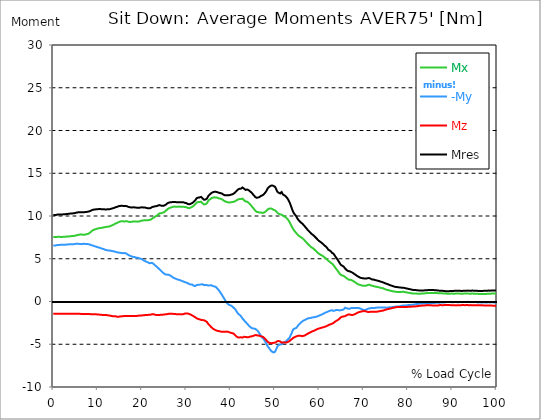
| Category |  Mx |  -My |  Mz |  Mres |
|---|---|---|---|---|
| 0.0 | 7.541 | 6.541 | -1.444 | 10.106 |
| 0.167348456675344 | 7.541 | 6.541 | -1.433 | 10.117 |
| 0.334696913350688 | 7.541 | 6.541 | -1.444 | 10.117 |
| 0.5020453700260321 | 7.541 | 6.552 | -1.444 | 10.117 |
| 0.669393826701376 | 7.53 | 6.575 | -1.444 | 10.128 |
| 0.83674228337672 | 7.541 | 6.597 | -1.444 | 10.151 |
| 1.0040907400520642 | 7.563 | 6.619 | -1.444 | 10.184 |
| 1.1621420602454444 | 7.574 | 6.619 | -1.444 | 10.184 |
| 1.3294905169207885 | 7.563 | 6.619 | -1.444 | 10.184 |
| 1.4968389735961325 | 7.563 | 6.619 | -1.444 | 10.184 |
| 1.6641874302714765 | 7.552 | 6.63 | -1.444 | 10.184 |
| 1.8315358869468206 | 7.552 | 6.63 | -1.433 | 10.184 |
| 1.9988843436221646 | 7.552 | 6.63 | -1.433 | 10.184 |
| 2.1662328002975086 | 7.563 | 6.63 | -1.444 | 10.195 |
| 2.333581256972853 | 7.563 | 6.641 | -1.433 | 10.195 |
| 2.5009297136481967 | 7.574 | 6.63 | -1.433 | 10.195 |
| 2.6682781703235405 | 7.574 | 6.641 | -1.433 | 10.206 |
| 2.8356266269988843 | 7.585 | 6.663 | -1.433 | 10.228 |
| 3.002975083674229 | 7.596 | 6.663 | -1.433 | 10.24 |
| 3.1703235403495724 | 7.607 | 6.663 | -1.433 | 10.24 |
| 3.337671997024917 | 7.607 | 6.675 | -1.433 | 10.251 |
| 3.4957233172182973 | 7.619 | 6.686 | -1.433 | 10.262 |
| 3.663071773893641 | 7.619 | 6.697 | -1.433 | 10.273 |
| 3.8304202305689854 | 7.63 | 6.697 | -1.433 | 10.284 |
| 3.997768687244329 | 7.641 | 6.708 | -1.433 | 10.295 |
| 4.165117143919673 | 7.663 | 6.697 | -1.433 | 10.306 |
| 4.332465600595017 | 7.663 | 6.708 | -1.433 | 10.306 |
| 4.499814057270361 | 7.663 | 6.708 | -1.433 | 10.317 |
| 4.667162513945706 | 7.674 | 6.708 | -1.444 | 10.317 |
| 4.834510970621049 | 7.685 | 6.719 | -1.444 | 10.339 |
| 5.001859427296393 | 7.707 | 6.741 | -1.444 | 10.362 |
| 5.169207883971737 | 7.741 | 6.752 | -1.444 | 10.395 |
| 5.336556340647081 | 7.763 | 6.741 | -1.444 | 10.417 |
| 5.503904797322425 | 7.785 | 6.73 | -1.444 | 10.417 |
| 5.671253253997769 | 7.796 | 6.741 | -1.444 | 10.428 |
| 5.82930457419115 | 7.818 | 6.741 | -1.433 | 10.439 |
| 5.996653030866494 | 7.83 | 6.73 | -1.444 | 10.451 |
| 6.164001487541838 | 7.852 | 6.719 | -1.444 | 10.451 |
| 6.331349944217181 | 7.852 | 6.708 | -1.455 | 10.451 |
| 6.498698400892526 | 7.841 | 6.719 | -1.455 | 10.451 |
| 6.66604685756787 | 7.807 | 6.741 | -1.455 | 10.451 |
| 6.833395314243213 | 7.807 | 6.763 | -1.455 | 10.462 |
| 7.000743770918558 | 7.818 | 6.741 | -1.466 | 10.451 |
| 7.168092227593902 | 7.83 | 6.719 | -1.477 | 10.451 |
| 7.335440684269246 | 7.841 | 6.719 | -1.477 | 10.462 |
| 7.50278914094459 | 7.863 | 6.73 | -1.466 | 10.484 |
| 7.6701375976199335 | 7.896 | 6.719 | -1.466 | 10.495 |
| 7.837486054295278 | 7.918 | 6.708 | -1.466 | 10.506 |
| 7.995537374488658 | 7.952 | 6.697 | -1.466 | 10.528 |
| 8.162885831164003 | 8.007 | 6.675 | -1.477 | 10.55 |
| 8.330234287839346 | 8.085 | 6.641 | -1.477 | 10.584 |
| 8.49758274451469 | 8.185 | 6.597 | -1.488 | 10.639 |
| 8.664931201190035 | 8.252 | 6.575 | -1.488 | 10.684 |
| 8.832279657865378 | 8.285 | 6.552 | -1.488 | 10.706 |
| 8.999628114540721 | 8.352 | 6.519 | -1.488 | 10.739 |
| 9.166976571216066 | 8.407 | 6.475 | -1.499 | 10.75 |
| 9.334325027891412 | 8.429 | 6.452 | -1.499 | 10.762 |
| 9.501673484566755 | 8.452 | 6.441 | -1.499 | 10.773 |
| 9.669021941242098 | 8.474 | 6.419 | -1.499 | 10.784 |
| 9.836370397917442 | 8.518 | 6.364 | -1.521 | 10.795 |
| 10.003718854592787 | 8.54 | 6.341 | -1.521 | 10.795 |
| 10.17106731126813 | 8.563 | 6.33 | -1.533 | 10.806 |
| 10.329118631461512 | 8.574 | 6.308 | -1.533 | 10.817 |
| 10.496467088136853 | 8.596 | 6.264 | -1.544 | 10.806 |
| 10.663815544812199 | 8.596 | 6.241 | -1.544 | 10.806 |
| 10.831164001487544 | 8.607 | 6.208 | -1.555 | 10.795 |
| 10.998512458162887 | 8.629 | 6.175 | -1.566 | 10.784 |
| 11.16586091483823 | 8.64 | 6.153 | -1.566 | 10.784 |
| 11.333209371513574 | 8.663 | 6.13 | -1.566 | 10.784 |
| 11.50055782818892 | 8.685 | 6.097 | -1.566 | 10.784 |
| 11.667906284864264 | 8.696 | 6.053 | -1.577 | 10.773 |
| 11.835254741539607 | 8.707 | 6.03 | -1.577 | 10.773 |
| 12.00260319821495 | 8.729 | 6.008 | -1.588 | 10.773 |
| 12.169951654890292 | 8.729 | 5.997 | -1.599 | 10.773 |
| 12.337300111565641 | 8.762 | 5.964 | -1.621 | 10.784 |
| 12.504648568240984 | 8.751 | 5.975 | -1.621 | 10.784 |
| 12.662699888434362 | 8.774 | 5.964 | -1.633 | 10.795 |
| 12.830048345109708 | 8.807 | 5.93 | -1.655 | 10.806 |
| 12.997396801785053 | 8.851 | 5.93 | -1.677 | 10.839 |
| 13.164745258460396 | 8.907 | 5.897 | -1.71 | 10.873 |
| 13.33209371513574 | 8.929 | 5.897 | -1.71 | 10.895 |
| 13.499442171811083 | 8.951 | 5.886 | -1.721 | 10.906 |
| 13.666790628486426 | 9.007 | 5.864 | -1.721 | 10.939 |
| 13.834139085161771 | 9.062 | 5.864 | -1.71 | 10.995 |
| 14.001487541837117 | 9.118 | 5.819 | -1.721 | 11.017 |
| 14.16883599851246 | 9.151 | 5.775 | -1.755 | 11.039 |
| 14.336184455187803 | 9.173 | 5.753 | -1.777 | 11.061 |
| 14.503532911863147 | 9.218 | 5.742 | -1.788 | 11.095 |
| 14.670881368538492 | 9.273 | 5.731 | -1.788 | 11.139 |
| 14.828932688731873 | 9.307 | 5.708 | -1.766 | 11.161 |
| 14.996281145407215 | 9.34 | 5.697 | -1.755 | 11.172 |
| 15.163629602082558 | 9.362 | 5.697 | -1.733 | 11.195 |
| 15.330978058757903 | 9.384 | 5.675 | -1.733 | 11.195 |
| 15.498326515433247 | 9.384 | 5.664 | -1.733 | 11.184 |
| 15.665674972108594 | 9.384 | 5.653 | -1.721 | 11.184 |
| 15.833023428783937 | 9.373 | 5.653 | -1.71 | 11.172 |
| 16.00037188545928 | 9.351 | 5.664 | -1.699 | 11.161 |
| 16.167720342134626 | 9.351 | 5.653 | -1.699 | 11.161 |
| 16.335068798809967 | 9.384 | 5.642 | -1.71 | 11.172 |
| 16.502417255485312 | 9.384 | 5.586 | -1.71 | 11.15 |
| 16.669765712160658 | 9.373 | 5.531 | -1.71 | 11.128 |
| 16.837114168836 | 9.34 | 5.464 | -1.71 | 11.084 |
| 17.004462625511344 | 9.318 | 5.42 | -1.71 | 11.05 |
| 17.16251394570472 | 9.296 | 5.364 | -1.71 | 11.017 |
| 17.32986240238007 | 9.307 | 5.342 | -1.699 | 11.017 |
| 17.497210859055414 | 9.318 | 5.297 | -1.699 | 11.006 |
| 17.664559315730756 | 9.318 | 5.264 | -1.699 | 10.995 |
| 17.8319077724061 | 9.351 | 5.231 | -1.699 | 11.006 |
| 17.999256229081443 | 9.362 | 5.22 | -1.699 | 11.017 |
| 18.166604685756788 | 9.362 | 5.198 | -1.699 | 11.017 |
| 18.333953142432133 | 9.362 | 5.198 | -1.699 | 11.006 |
| 18.501301599107478 | 9.351 | 5.175 | -1.688 | 10.995 |
| 18.668650055782823 | 9.351 | 5.131 | -1.688 | 10.984 |
| 18.835998512458165 | 9.34 | 5.131 | -1.688 | 10.973 |
| 19.00334696913351 | 9.34 | 5.131 | -1.677 | 10.961 |
| 19.170695425808855 | 9.329 | 5.12 | -1.666 | 10.95 |
| 19.338043882484197 | 9.351 | 5.053 | -1.655 | 10.961 |
| 19.496095202677576 | 9.384 | 5.02 | -1.644 | 10.973 |
| 19.66344365935292 | 9.418 | 5.009 | -1.644 | 10.995 |
| 19.830792116028263 | 9.44 | 4.998 | -1.644 | 11.006 |
| 19.998140572703612 | 9.462 | 4.953 | -1.633 | 11.017 |
| 20.165489029378953 | 9.473 | 4.898 | -1.621 | 11.006 |
| 20.3328374860543 | 9.484 | 4.82 | -1.61 | 10.995 |
| 20.500185942729644 | 9.507 | 4.775 | -1.61 | 10.995 |
| 20.667534399404985 | 9.518 | 4.742 | -1.588 | 10.995 |
| 20.83488285608033 | 9.495 | 4.709 | -1.577 | 10.961 |
| 21.002231312755672 | 9.507 | 4.653 | -1.566 | 10.939 |
| 21.16957976943102 | 9.495 | 4.62 | -1.566 | 10.917 |
| 21.336928226106362 | 9.507 | 4.576 | -1.566 | 10.906 |
| 21.504276682781704 | 9.529 | 4.52 | -1.566 | 10.895 |
| 21.67162513945705 | 9.54 | 4.476 | -1.555 | 10.895 |
| 21.82967645965043 | 9.562 | 4.431 | -1.555 | 10.895 |
| 21.997024916325774 | 9.584 | 4.498 | -1.533 | 10.95 |
| 22.16437337300112 | 9.651 | 4.531 | -1.499 | 11.017 |
| 22.33172182967646 | 9.718 | 4.498 | -1.477 | 11.061 |
| 22.499070286351806 | 9.762 | 4.442 | -1.477 | 11.072 |
| 22.666418743027148 | 9.818 | 4.365 | -1.499 | 11.095 |
| 22.833767199702496 | 9.884 | 4.287 | -1.533 | 11.117 |
| 23.00111565637784 | 9.951 | 4.209 | -1.555 | 11.139 |
| 23.168464113053183 | 9.984 | 4.131 | -1.577 | 11.15 |
| 23.335812569728528 | 10.029 | 4.065 | -1.588 | 11.161 |
| 23.50316102640387 | 10.095 | 3.987 | -1.577 | 11.184 |
| 23.670509483079215 | 10.195 | 3.898 | -1.577 | 11.239 |
| 23.83785793975456 | 10.284 | 3.82 | -1.577 | 11.272 |
| 23.995909259947936 | 10.317 | 3.743 | -1.566 | 11.272 |
| 24.163257716623285 | 10.317 | 3.665 | -1.555 | 11.239 |
| 24.330606173298627 | 10.328 | 3.565 | -1.555 | 11.206 |
| 24.49795462997397 | 10.362 | 3.487 | -1.544 | 11.206 |
| 24.665303086649313 | 10.384 | 3.398 | -1.544 | 11.195 |
| 24.83265154332466 | 10.417 | 3.332 | -1.533 | 11.195 |
| 25.0 | 10.451 | 3.265 | -1.521 | 11.217 |
| 25.167348456675345 | 10.517 | 3.21 | -1.51 | 11.261 |
| 25.334696913350694 | 10.595 | 3.154 | -1.499 | 11.317 |
| 25.502045370026035 | 10.673 | 3.11 | -1.499 | 11.383 |
| 25.669393826701377 | 10.762 | 3.143 | -1.477 | 11.461 |
| 25.836742283376722 | 10.828 | 3.143 | -1.466 | 11.517 |
| 26.004090740052067 | 10.884 | 3.143 | -1.444 | 11.561 |
| 26.17143919672741 | 10.928 | 3.121 | -1.433 | 11.594 |
| 26.329490516920792 | 10.961 | 3.054 | -1.433 | 11.594 |
| 26.49683897359613 | 10.984 | 2.965 | -1.433 | 11.606 |
| 26.66418743027148 | 11.017 | 2.932 | -1.433 | 11.617 |
| 26.831535886946828 | 11.05 | 2.865 | -1.433 | 11.628 |
| 26.998884343622166 | 11.072 | 2.81 | -1.444 | 11.639 |
| 27.166232800297514 | 11.084 | 2.765 | -1.455 | 11.639 |
| 27.333581256972852 | 11.106 | 2.721 | -1.466 | 11.65 |
| 27.5009297136482 | 11.095 | 2.688 | -1.477 | 11.628 |
| 27.668278170323543 | 11.084 | 2.654 | -1.477 | 11.617 |
| 27.835626626998888 | 11.072 | 2.588 | -1.477 | 11.594 |
| 28.002975083674233 | 11.084 | 2.565 | -1.488 | 11.606 |
| 28.170323540349575 | 11.084 | 2.543 | -1.488 | 11.606 |
| 28.33767199702492 | 11.106 | 2.543 | -1.477 | 11.617 |
| 28.50502045370026 | 11.106 | 2.51 | -1.477 | 11.617 |
| 28.663071773893645 | 11.072 | 2.465 | -1.477 | 11.594 |
| 28.830420230568986 | 11.072 | 2.432 | -1.499 | 11.594 |
| 28.99776868724433 | 11.084 | 2.41 | -1.51 | 11.606 |
| 29.165117143919673 | 11.084 | 2.366 | -1.499 | 11.606 |
| 29.33246560059502 | 11.084 | 2.332 | -1.477 | 11.606 |
| 29.499814057270367 | 11.072 | 2.288 | -1.444 | 11.572 |
| 29.66716251394571 | 11.05 | 2.266 | -1.41 | 11.539 |
| 29.834510970621054 | 11.05 | 2.243 | -1.399 | 11.539 |
| 30.00185942729639 | 11.028 | 2.21 | -1.399 | 11.506 |
| 30.169207883971744 | 10.984 | 2.177 | -1.41 | 11.461 |
| 30.33655634064708 | 10.939 | 2.143 | -1.41 | 11.406 |
| 30.50390479732243 | 10.939 | 2.066 | -1.444 | 11.395 |
| 30.671253253997772 | 10.917 | 2.032 | -1.466 | 11.372 |
| 30.829304574191156 | 10.939 | 1.999 | -1.499 | 11.383 |
| 30.996653030866494 | 10.995 | 1.988 | -1.533 | 11.428 |
| 31.164001487541842 | 11.017 | 2.01 | -1.588 | 11.45 |
| 31.331349944217187 | 11.072 | 1.977 | -1.633 | 11.517 |
| 31.498698400892525 | 11.15 | 1.932 | -1.677 | 11.594 |
| 31.666046857567874 | 11.217 | 1.844 | -1.733 | 11.661 |
| 31.833395314243212 | 11.283 | 1.788 | -1.788 | 11.739 |
| 32.00074377091856 | 11.361 | 1.81 | -1.844 | 11.828 |
| 32.1680922275939 | 11.472 | 1.877 | -1.899 | 11.961 |
| 32.33544068426925 | 11.572 | 1.932 | -1.966 | 12.083 |
| 32.50278914094459 | 11.617 | 1.932 | -2.01 | 12.128 |
| 32.670137597619934 | 11.628 | 1.955 | -2.043 | 12.15 |
| 32.83748605429528 | 11.606 | 1.977 | -2.066 | 12.139 |
| 33.004834510970625 | 11.628 | 1.966 | -2.088 | 12.172 |
| 33.162885831164004 | 11.661 | 1.955 | -2.121 | 12.216 |
| 33.33023428783935 | 11.672 | 1.999 | -2.155 | 12.239 |
| 33.497582744514695 | 11.572 | 2.01 | -2.166 | 12.15 |
| 33.664931201190036 | 11.472 | 2.01 | -2.177 | 12.05 |
| 33.83227965786538 | 11.395 | 1.977 | -2.177 | 11.961 |
| 33.99962811454073 | 11.35 | 1.91 | -2.199 | 11.905 |
| 34.16697657121607 | 11.35 | 1.888 | -2.232 | 11.894 |
| 34.33432502789141 | 11.383 | 1.944 | -2.277 | 11.928 |
| 34.50167348456676 | 11.428 | 1.955 | -2.332 | 11.972 |
| 34.6690219412421 | 11.506 | 1.91 | -2.41 | 12.05 |
| 34.83637039791744 | 11.661 | 1.877 | -2.543 | 12.216 |
| 35.00371885459279 | 11.817 | 1.866 | -2.665 | 12.372 |
| 35.17106731126814 | 11.894 | 1.877 | -2.754 | 12.472 |
| 35.338415767943474 | 11.95 | 1.888 | -2.843 | 12.538 |
| 35.49646708813686 | 12.005 | 1.888 | -2.932 | 12.605 |
| 35.6638155448122 | 12.072 | 1.899 | -3.021 | 12.694 |
| 35.831164001487544 | 12.128 | 1.844 | -3.11 | 12.749 |
| 35.998512458162885 | 12.15 | 1.799 | -3.176 | 12.783 |
| 36.165860914838234 | 12.183 | 1.788 | -3.232 | 12.816 |
| 36.333209371513576 | 12.183 | 1.766 | -3.276 | 12.827 |
| 36.50055782818892 | 12.183 | 1.755 | -3.321 | 12.838 |
| 36.667906284864266 | 12.172 | 1.699 | -3.365 | 12.827 |
| 36.83525474153961 | 12.161 | 1.621 | -3.409 | 12.816 |
| 37.002603198214956 | 12.139 | 1.51 | -3.432 | 12.783 |
| 37.1699516548903 | 12.094 | 1.399 | -3.454 | 12.738 |
| 37.337300111565646 | 12.061 | 1.31 | -3.465 | 12.716 |
| 37.50464856824098 | 12.05 | 1.199 | -3.487 | 12.694 |
| 37.66269988843437 | 12.028 | 1.066 | -3.509 | 12.683 |
| 37.83004834510971 | 12.005 | 0.933 | -3.521 | 12.661 |
| 37.99739680178505 | 11.961 | 0.8 | -3.532 | 12.627 |
| 38.16474525846039 | 11.917 | 0.655 | -3.532 | 12.583 |
| 38.33209371513574 | 11.839 | 0.511 | -3.532 | 12.516 |
| 38.49944217181109 | 11.772 | 0.366 | -3.532 | 12.461 |
| 38.666790628486424 | 11.728 | 0.222 | -3.543 | 12.427 |
| 38.83413908516178 | 11.694 | 0.078 | -3.532 | 12.427 |
| 39.001487541837115 | 11.661 | -0.067 | -3.521 | 12.427 |
| 39.16883599851246 | 11.628 | -0.178 | -3.521 | 12.427 |
| 39.336184455187805 | 11.606 | -0.278 | -3.532 | 12.427 |
| 39.503532911863154 | 11.572 | -0.344 | -3.554 | 12.427 |
| 39.670881368538495 | 11.572 | -0.4 | -3.598 | 12.438 |
| 39.83822982521384 | 11.583 | -0.433 | -3.632 | 12.461 |
| 39.996281145407224 | 11.606 | -0.455 | -3.654 | 12.483 |
| 40.163629602082565 | 11.617 | -0.5 | -3.676 | 12.505 |
| 40.33097805875791 | 11.628 | -0.566 | -3.698 | 12.527 |
| 40.498326515433256 | 11.65 | -0.655 | -3.754 | 12.572 |
| 40.6656749721086 | 11.661 | -0.733 | -3.754 | 12.616 |
| 40.83302342878393 | 11.694 | -0.811 | -3.831 | 12.683 |
| 41.00037188545929 | 11.728 | -0.888 | -3.92 | 12.749 |
| 41.16772034213463 | 11.772 | -1.022 | -4.009 | 12.838 |
| 41.33506879880997 | 11.839 | -1.166 | -4.098 | 12.938 |
| 41.50241725548531 | 11.905 | -1.288 | -4.176 | 13.038 |
| 41.66976571216066 | 11.939 | -1.433 | -4.198 | 13.105 |
| 41.837114168836 | 11.972 | -1.499 | -4.198 | 13.149 |
| 42.004462625511344 | 11.983 | -1.555 | -4.198 | 13.183 |
| 42.17181108218669 | 11.983 | -1.633 | -4.187 | 13.183 |
| 42.32986240238007 | 11.983 | -1.721 | -4.187 | 13.205 |
| 42.497210859055414 | 12.028 | -1.866 | -4.209 | 13.283 |
| 42.66455931573076 | 12.039 | -1.999 | -4.22 | 13.338 |
| 42.831907772406105 | 11.939 | -2.077 | -4.154 | 13.271 |
| 42.999256229081446 | 11.861 | -2.177 | -4.131 | 13.205 |
| 43.16660468575679 | 11.783 | -2.299 | -4.131 | 13.127 |
| 43.33395314243214 | 11.694 | -2.399 | -4.142 | 13.049 |
| 43.50130159910748 | 11.694 | -2.465 | -4.165 | 13.083 |
| 43.66865005578282 | 11.683 | -2.554 | -4.176 | 13.105 |
| 43.83599851245817 | 11.628 | -2.665 | -4.176 | 13.083 |
| 44.00334696913351 | 11.561 | -2.776 | -4.176 | 13.038 |
| 44.17069542580886 | 11.494 | -2.865 | -4.142 | 12.983 |
| 44.3380438824842 | 11.383 | -2.932 | -4.109 | 12.894 |
| 44.49609520267758 | 11.295 | -3.01 | -4.098 | 12.838 |
| 44.66344365935292 | 11.206 | -3.054 | -4.098 | 12.761 |
| 44.83079211602827 | 11.084 | -3.132 | -4.076 | 12.661 |
| 44.99814057270361 | 10.984 | -3.143 | -4.031 | 12.55 |
| 45.16548902937895 | 10.884 | -3.165 | -3.998 | 12.461 |
| 45.332837486054295 | 10.784 | -3.176 | -3.976 | 12.361 |
| 45.500185942729644 | 10.65 | -3.187 | -3.931 | 12.239 |
| 45.66753439940499 | 10.55 | -3.232 | -3.92 | 12.15 |
| 45.83488285608033 | 10.495 | -3.31 | -3.931 | 12.128 |
| 46.00223131275568 | 10.462 | -3.387 | -3.965 | 12.139 |
| 46.16957976943102 | 10.451 | -3.476 | -3.987 | 12.161 |
| 46.336928226106366 | 10.417 | -3.587 | -3.987 | 12.172 |
| 46.50427668278171 | 10.406 | -3.743 | -3.987 | 12.216 |
| 46.671625139457056 | 10.406 | -3.865 | -4.043 | 12.283 |
| 46.829676459650436 | 10.406 | -4.02 | -4.065 | 12.35 |
| 46.99702491632577 | 10.395 | -4.165 | -4.087 | 12.416 |
| 47.16437337300112 | 10.362 | -4.242 | -4.098 | 12.416 |
| 47.33172182967646 | 10.373 | -4.331 | -4.154 | 12.472 |
| 47.49907028635181 | 10.395 | -4.442 | -4.231 | 12.55 |
| 47.66641874302716 | 10.439 | -4.587 | -4.309 | 12.649 |
| 47.83376719970249 | 10.506 | -4.698 | -4.398 | 12.761 |
| 48.001115656377834 | 10.573 | -4.864 | -4.487 | 12.883 |
| 48.16846411305319 | 10.65 | -5.042 | -4.609 | 13.038 |
| 48.33581256972853 | 10.773 | -5.242 | -4.72 | 13.227 |
| 48.50316102640387 | 10.806 | -5.297 | -4.775 | 13.316 |
| 48.67050948307921 | 10.85 | -5.442 | -4.82 | 13.405 |
| 48.837857939754564 | 10.884 | -5.575 | -4.853 | 13.471 |
| 49.005206396429905 | 10.884 | -5.697 | -4.875 | 13.527 |
| 49.163257716623285 | 10.873 | -5.786 | -4.875 | 13.56 |
| 49.33060617329863 | 10.839 | -5.864 | -4.864 | 13.571 |
| 49.49795462997397 | 10.784 | -5.93 | -4.842 | 13.549 |
| 49.66530308664932 | 10.728 | -5.964 | -4.82 | 13.516 |
| 49.832651543324666 | 10.684 | -5.942 | -4.831 | 13.471 |
| 50.0 | 10.662 | -5.886 | -4.842 | 13.416 |
| 50.16734845667534 | 10.606 | -5.719 | -4.775 | 13.271 |
| 50.33469691335069 | 10.506 | -5.508 | -4.709 | 13.072 |
| 50.50204537002604 | 10.406 | -5.309 | -4.642 | 12.86 |
| 50.66939382670139 | 10.317 | -5.164 | -4.598 | 12.749 |
| 50.836742283376715 | 10.273 | -5.109 | -4.62 | 12.716 |
| 51.00409074005207 | 10.228 | -5.053 | -4.642 | 12.672 |
| 51.17143919672741 | 10.173 | -4.998 | -4.676 | 12.638 |
| 51.32949051692079 | 10.173 | -5.009 | -4.731 | 12.683 |
| 51.496838973596134 | 10.228 | -5.12 | -4.809 | 12.805 |
| 51.66418743027148 | 10.106 | -4.975 | -4.787 | 12.627 |
| 51.831535886946824 | 10.017 | -4.842 | -4.775 | 12.494 |
| 51.99888434362217 | 9.984 | -4.798 | -4.798 | 12.438 |
| 52.16623280029752 | 9.962 | -4.753 | -4.809 | 12.405 |
| 52.33358125697285 | 9.884 | -4.709 | -4.809 | 12.339 |
| 52.5009297136482 | 9.818 | -4.664 | -4.798 | 12.261 |
| 52.668278170323546 | 9.74 | -4.587 | -4.787 | 12.172 |
| 52.835626626998895 | 9.64 | -4.476 | -4.753 | 12.039 |
| 53.00297508367424 | 9.529 | -4.387 | -4.72 | 11.894 |
| 53.17032354034958 | 9.384 | -4.309 | -4.653 | 11.728 |
| 53.33767199702492 | 9.229 | -4.187 | -4.587 | 11.539 |
| 53.50502045370027 | 9.073 | -3.987 | -4.52 | 11.317 |
| 53.663071773893655 | 8.896 | -3.809 | -4.465 | 11.072 |
| 53.83042023056899 | 8.718 | -3.609 | -4.387 | 10.817 |
| 53.99776868724433 | 8.563 | -3.387 | -4.298 | 10.606 |
| 54.16511714391967 | 8.418 | -3.232 | -4.231 | 10.417 |
| 54.33246560059503 | 8.296 | -3.176 | -4.187 | 10.273 |
| 54.49981405727037 | 8.185 | -3.154 | -4.154 | 10.173 |
| 54.667162513945705 | 8.085 | -3.11 | -4.12 | 10.062 |
| 54.834510970621054 | 7.985 | -3.076 | -4.076 | 9.929 |
| 55.0018594272964 | 7.874 | -2.965 | -4.054 | 9.762 |
| 55.169207883971744 | 7.774 | -2.832 | -4.02 | 9.618 |
| 55.336556340647086 | 7.696 | -2.732 | -4.009 | 9.507 |
| 55.50390479732243 | 7.641 | -2.643 | -4.009 | 9.418 |
| 55.671253253997776 | 7.574 | -2.543 | -4.009 | 9.318 |
| 55.83860171067312 | 7.519 | -2.465 | -4.02 | 9.24 |
| 55.9966530308665 | 7.474 | -2.399 | -4.043 | 9.184 |
| 56.16400148754184 | 7.408 | -2.332 | -4.054 | 9.107 |
| 56.33134994421718 | 7.33 | -2.277 | -4.031 | 9.018 |
| 56.498698400892536 | 7.252 | -2.21 | -4.009 | 8.918 |
| 56.66604685756788 | 7.152 | -2.155 | -3.976 | 8.818 |
| 56.83339531424321 | 7.063 | -2.132 | -3.943 | 8.718 |
| 57.00074377091856 | 6.963 | -2.11 | -3.898 | 8.629 |
| 57.16809222759391 | 6.852 | -2.043 | -3.831 | 8.507 |
| 57.33544068426925 | 6.763 | -1.999 | -3.776 | 8.396 |
| 57.5027891409446 | 6.675 | -1.966 | -3.732 | 8.296 |
| 57.670137597619934 | 6.597 | -1.944 | -3.676 | 8.207 |
| 57.83748605429528 | 6.519 | -1.944 | -3.643 | 8.129 |
| 58.004834510970625 | 6.43 | -1.944 | -3.598 | 8.029 |
| 58.16288583116401 | 6.364 | -1.91 | -3.554 | 7.941 |
| 58.330234287839346 | 6.297 | -1.888 | -3.509 | 7.874 |
| 58.497582744514695 | 6.253 | -1.866 | -3.476 | 7.818 |
| 58.66493120119004 | 6.197 | -1.866 | -3.454 | 7.763 |
| 58.832279657865385 | 6.108 | -1.832 | -3.409 | 7.663 |
| 58.999628114540734 | 6.019 | -1.81 | -3.365 | 7.574 |
| 59.16697657121607 | 5.942 | -1.799 | -3.321 | 7.485 |
| 59.33432502789142 | 5.875 | -1.788 | -3.287 | 7.408 |
| 59.50167348456676 | 5.775 | -1.755 | -3.243 | 7.308 |
| 59.66902194124211 | 5.675 | -1.721 | -3.198 | 7.208 |
| 59.83637039791745 | 5.608 | -1.677 | -3.165 | 7.13 |
| 60.00371885459278 | 5.564 | -1.644 | -3.143 | 7.074 |
| 60.17106731126813 | 5.497 | -1.61 | -3.121 | 6.997 |
| 60.33841576794349 | 5.453 | -1.566 | -3.099 | 6.93 |
| 60.49646708813685 | 5.409 | -1.533 | -3.065 | 6.874 |
| 60.6638155448122 | 5.364 | -1.488 | -3.043 | 6.808 |
| 60.831164001487544 | 5.297 | -1.444 | -3.021 | 6.719 |
| 60.99851245816289 | 5.231 | -1.399 | -2.999 | 6.641 |
| 61.16586091483824 | 5.164 | -1.355 | -2.965 | 6.552 |
| 61.333209371513576 | 5.098 | -1.299 | -2.932 | 6.464 |
| 61.50055782818892 | 5.053 | -1.266 | -2.91 | 6.408 |
| 61.667906284864266 | 4.964 | -1.233 | -2.865 | 6.297 |
| 61.835254741539615 | 4.887 | -1.211 | -2.832 | 6.219 |
| 62.002603198214956 | 4.764 | -1.155 | -2.754 | 6.064 |
| 62.16995165489029 | 4.687 | -1.122 | -2.721 | 5.997 |
| 62.33730011156564 | 4.653 | -1.077 | -2.71 | 5.975 |
| 62.504648568240995 | 4.587 | -1.066 | -2.688 | 5.919 |
| 62.67199702491633 | 4.498 | -1.044 | -2.654 | 5.831 |
| 62.83004834510971 | 4.398 | -1.011 | -2.599 | 5.697 |
| 62.99739680178505 | 4.376 | -1.055 | -2.588 | 5.686 |
| 63.1647452584604 | 4.276 | -1.099 | -2.532 | 5.608 |
| 63.33209371513575 | 4.154 | -1.077 | -2.454 | 5.486 |
| 63.4994421718111 | 4.031 | -1.055 | -2.377 | 5.353 |
| 63.666790628486424 | 3.898 | -1.022 | -2.31 | 5.22 |
| 63.83413908516177 | 3.809 | -0.988 | -2.266 | 5.12 |
| 64.00148754183712 | 3.687 | -0.977 | -2.21 | 4.986 |
| 64.16883599851248 | 3.565 | -0.988 | -2.166 | 4.875 |
| 64.3361844551878 | 3.454 | -1.033 | -2.11 | 4.731 |
| 64.50353291186315 | 3.332 | -1.044 | -2.032 | 4.576 |
| 64.6708813685385 | 3.21 | -1.033 | -1.944 | 4.431 |
| 64.83822982521384 | 3.121 | -1.011 | -1.855 | 4.298 |
| 65.00557828188919 | 3.065 | -1 | -1.81 | 4.231 |
| 65.16362960208257 | 3.032 | -0.988 | -1.777 | 4.187 |
| 65.3309780587579 | 3.032 | -0.977 | -1.766 | 4.154 |
| 65.49832651543326 | 2.987 | -0.911 | -1.744 | 4.076 |
| 65.6656749721086 | 2.932 | -0.822 | -1.721 | 3.965 |
| 65.83302342878395 | 2.888 | -0.722 | -1.71 | 3.854 |
| 66.00037188545929 | 2.788 | -0.766 | -1.666 | 3.765 |
| 66.16772034213463 | 2.71 | -0.8 | -1.61 | 3.676 |
| 66.33506879880998 | 2.654 | -0.822 | -1.566 | 3.632 |
| 66.50241725548531 | 2.599 | -0.833 | -1.521 | 3.565 |
| 66.66976571216065 | 2.543 | -0.822 | -1.488 | 3.487 |
| 66.83711416883601 | 2.565 | -0.855 | -1.51 | 3.532 |
| 67.00446262551135 | 2.543 | -0.8 | -1.533 | 3.476 |
| 67.1718110821867 | 2.521 | -0.777 | -1.566 | 3.454 |
| 67.32986240238007 | 2.488 | -0.755 | -1.577 | 3.421 |
| 67.49721085905541 | 2.443 | -0.744 | -1.577 | 3.365 |
| 67.66455931573076 | 2.388 | -0.744 | -1.555 | 3.31 |
| 67.83190777240611 | 2.332 | -0.766 | -1.521 | 3.243 |
| 67.99925622908145 | 2.277 | -0.766 | -1.488 | 3.187 |
| 68.16660468575678 | 2.21 | -0.766 | -1.444 | 3.121 |
| 68.33395314243214 | 2.155 | -0.766 | -1.388 | 3.054 |
| 68.50130159910749 | 2.088 | -0.755 | -1.344 | 2.999 |
| 68.66865005578282 | 2.032 | -0.755 | -1.299 | 2.943 |
| 68.83599851245816 | 1.999 | -0.755 | -1.266 | 2.899 |
| 69.00334696913352 | 1.966 | -0.766 | -1.233 | 2.854 |
| 69.17069542580886 | 1.932 | -0.811 | -1.211 | 2.799 |
| 69.3380438824842 | 1.91 | -0.844 | -1.188 | 2.776 |
| 69.50539233915956 | 1.877 | -0.888 | -1.166 | 2.743 |
| 69.66344365935292 | 1.866 | -0.922 | -1.144 | 2.721 |
| 69.83079211602826 | 1.855 | -0.955 | -1.133 | 2.721 |
| 69.99814057270362 | 1.844 | -0.988 | -1.122 | 2.71 |
| 70.16548902937896 | 1.821 | -1.011 | -1.122 | 2.688 |
| 70.33283748605429 | 1.832 | -0.988 | -1.133 | 2.688 |
| 70.50018594272964 | 1.844 | -0.966 | -1.144 | 2.676 |
| 70.667534399405 | 1.866 | -0.922 | -1.177 | 2.699 |
| 70.83488285608033 | 1.91 | -0.888 | -1.211 | 2.721 |
| 71.00223131275568 | 1.944 | -0.855 | -1.222 | 2.732 |
| 71.16957976943102 | 1.966 | -0.822 | -1.233 | 2.743 |
| 71.33692822610637 | 1.955 | -0.811 | -1.211 | 2.721 |
| 71.50427668278171 | 1.932 | -0.789 | -1.199 | 2.688 |
| 71.67162513945706 | 1.877 | -0.766 | -1.199 | 2.621 |
| 71.8389735961324 | 1.844 | -0.744 | -1.199 | 2.588 |
| 71.99702491632577 | 1.832 | -0.755 | -1.199 | 2.588 |
| 72.16437337300113 | 1.821 | -0.766 | -1.211 | 2.577 |
| 72.33172182967647 | 1.788 | -0.766 | -1.211 | 2.554 |
| 72.49907028635181 | 1.755 | -0.755 | -1.211 | 2.521 |
| 72.66641874302715 | 1.733 | -0.722 | -1.211 | 2.499 |
| 72.8337671997025 | 1.721 | -0.722 | -1.199 | 2.477 |
| 73.00111565637783 | 1.71 | -0.722 | -1.188 | 2.454 |
| 73.16846411305319 | 1.699 | -0.711 | -1.177 | 2.432 |
| 73.33581256972853 | 1.677 | -0.7 | -1.155 | 2.41 |
| 73.50316102640387 | 1.644 | -0.711 | -1.144 | 2.388 |
| 73.67050948307921 | 1.621 | -0.711 | -1.133 | 2.354 |
| 73.83785793975457 | 1.599 | -0.7 | -1.111 | 2.321 |
| 74.00520639642991 | 1.577 | -0.689 | -1.099 | 2.299 |
| 74.16325771662328 | 1.577 | -0.689 | -1.077 | 2.277 |
| 74.33060617329863 | 1.555 | -0.689 | -1.066 | 2.254 |
| 74.49795462997398 | 1.51 | -0.7 | -1.044 | 2.21 |
| 74.66530308664932 | 1.477 | -0.689 | -1.011 | 2.177 |
| 74.83265154332466 | 1.422 | -0.711 | -0.977 | 2.132 |
| 75.00000000000001 | 1.399 | -0.722 | -0.944 | 2.099 |
| 75.16734845667534 | 1.377 | -0.722 | -0.922 | 2.077 |
| 75.3346969133507 | 1.355 | -0.711 | -0.911 | 2.032 |
| 75.50204537002605 | 1.333 | -0.711 | -0.888 | 2.01 |
| 75.66939382670138 | 1.322 | -0.689 | -0.866 | 1.966 |
| 75.83674228337672 | 1.288 | -0.677 | -0.844 | 1.932 |
| 76.00409074005208 | 1.266 | -0.689 | -0.822 | 1.91 |
| 76.17143919672742 | 1.244 | -0.689 | -0.811 | 1.877 |
| 76.33878765340276 | 1.222 | -0.655 | -0.789 | 1.832 |
| 76.49683897359614 | 1.211 | -0.644 | -0.755 | 1.81 |
| 76.66418743027148 | 1.188 | -0.633 | -0.733 | 1.777 |
| 76.83153588694682 | 1.166 | -0.622 | -0.722 | 1.755 |
| 76.99888434362218 | 1.155 | -0.611 | -0.7 | 1.733 |
| 77.16623280029752 | 1.144 | -0.6 | -0.689 | 1.71 |
| 77.33358125697285 | 1.133 | -0.6 | -0.677 | 1.699 |
| 77.5009297136482 | 1.122 | -0.589 | -0.655 | 1.688 |
| 77.66827817032356 | 1.111 | -0.589 | -0.644 | 1.666 |
| 77.83562662699889 | 1.111 | -0.589 | -0.633 | 1.666 |
| 78.00297508367423 | 1.099 | -0.578 | -0.622 | 1.655 |
| 78.17032354034959 | 1.099 | -0.555 | -0.633 | 1.644 |
| 78.33767199702493 | 1.111 | -0.533 | -0.633 | 1.633 |
| 78.50502045370027 | 1.122 | -0.5 | -0.655 | 1.621 |
| 78.67236891037561 | 1.133 | -0.489 | -0.655 | 1.621 |
| 78.83042023056899 | 1.133 | -0.478 | -0.655 | 1.61 |
| 78.99776868724433 | 1.133 | -0.466 | -0.655 | 1.599 |
| 79.16511714391969 | 1.111 | -0.466 | -0.655 | 1.588 |
| 79.33246560059503 | 1.099 | -0.455 | -0.655 | 1.566 |
| 79.49981405727036 | 1.077 | -0.455 | -0.644 | 1.544 |
| 79.66716251394571 | 1.066 | -0.455 | -0.644 | 1.533 |
| 79.83451097062107 | 1.055 | -0.444 | -0.633 | 1.51 |
| 80.00185942729641 | 1.033 | -0.433 | -0.622 | 1.488 |
| 80.16920788397174 | 1.011 | -0.411 | -0.611 | 1.466 |
| 80.33655634064709 | 1 | -0.4 | -0.611 | 1.444 |
| 80.50390479732243 | 0.988 | -0.4 | -0.611 | 1.433 |
| 80.67125325399778 | 0.966 | -0.389 | -0.6 | 1.41 |
| 80.83860171067312 | 0.955 | -0.389 | -0.6 | 1.388 |
| 80.99665303086651 | 0.944 | -0.389 | -0.589 | 1.377 |
| 81.16400148754184 | 0.933 | -0.378 | -0.589 | 1.355 |
| 81.3313499442172 | 0.933 | -0.355 | -0.578 | 1.344 |
| 81.49869840089255 | 0.933 | -0.333 | -0.578 | 1.333 |
| 81.66604685756786 | 0.922 | -0.311 | -0.566 | 1.333 |
| 81.83339531424322 | 0.911 | -0.3 | -0.566 | 1.333 |
| 82.00074377091858 | 0.922 | -0.3 | -0.566 | 1.322 |
| 82.16809222759392 | 0.911 | -0.289 | -0.544 | 1.31 |
| 82.33544068426926 | 0.9 | -0.267 | -0.522 | 1.299 |
| 82.50278914094459 | 0.9 | -0.255 | -0.511 | 1.288 |
| 82.67013759761994 | 0.911 | -0.244 | -0.511 | 1.299 |
| 82.83748605429528 | 0.922 | -0.244 | -0.5 | 1.299 |
| 83.00483451097062 | 0.922 | -0.244 | -0.489 | 1.299 |
| 83.17218296764597 | 0.922 | -0.244 | -0.478 | 1.288 |
| 83.33023428783935 | 0.933 | -0.233 | -0.455 | 1.277 |
| 83.4975827445147 | 0.933 | -0.211 | -0.466 | 1.288 |
| 83.66493120119004 | 0.944 | -0.211 | -0.466 | 1.299 |
| 83.83227965786537 | 0.955 | -0.233 | -0.466 | 1.31 |
| 83.99962811454073 | 0.966 | -0.233 | -0.455 | 1.31 |
| 84.16697657121607 | 0.977 | -0.222 | -0.433 | 1.31 |
| 84.33432502789142 | 0.988 | -0.211 | -0.422 | 1.322 |
| 84.50167348456677 | 0.988 | -0.2 | -0.422 | 1.333 |
| 84.6690219412421 | 0.988 | -0.2 | -0.433 | 1.333 |
| 84.83637039791745 | 0.988 | -0.2 | -0.444 | 1.333 |
| 85.0037188545928 | 0.988 | -0.222 | -0.444 | 1.333 |
| 85.17106731126813 | 0.988 | -0.211 | -0.444 | 1.333 |
| 85.33841576794349 | 1 | -0.2 | -0.444 | 1.344 |
| 85.50576422461883 | 1 | -0.178 | -0.466 | 1.344 |
| 85.66381554481221 | 0.988 | -0.178 | -0.466 | 1.333 |
| 85.83116400148755 | 0.988 | -0.189 | -0.466 | 1.333 |
| 85.99851245816289 | 1 | -0.178 | -0.455 | 1.322 |
| 86.16586091483823 | 1 | -0.155 | -0.455 | 1.322 |
| 86.33320937151358 | 1 | -0.133 | -0.444 | 1.322 |
| 86.50055782818893 | 0.988 | -0.122 | -0.455 | 1.31 |
| 86.66790628486427 | 0.977 | -0.133 | -0.455 | 1.299 |
| 86.83525474153961 | 0.966 | -0.144 | -0.455 | 1.277 |
| 87.00260319821496 | 0.955 | -0.144 | -0.433 | 1.266 |
| 87.16995165489031 | 0.955 | -0.133 | -0.422 | 1.266 |
| 87.33730011156564 | 0.966 | -0.122 | -0.422 | 1.266 |
| 87.504648568241 | 0.955 | -0.122 | -0.422 | 1.255 |
| 87.67199702491634 | 0.955 | -0.122 | -0.422 | 1.255 |
| 87.83004834510972 | 0.955 | -0.122 | -0.433 | 1.255 |
| 87.99739680178506 | 0.944 | -0.111 | -0.433 | 1.244 |
| 88.1647452584604 | 0.933 | -0.111 | -0.422 | 1.222 |
| 88.33209371513574 | 0.922 | -0.111 | -0.411 | 1.211 |
| 88.49944217181108 | 0.922 | -0.078 | -0.411 | 1.211 |
| 88.66679062848644 | 0.922 | -0.067 | -0.411 | 1.222 |
| 88.83413908516178 | 0.922 | -0.067 | -0.422 | 1.211 |
| 89.00148754183712 | 0.911 | -0.089 | -0.411 | 1.211 |
| 89.16883599851246 | 0.911 | -0.067 | -0.4 | 1.199 |
| 89.33618445518782 | 0.911 | -0.056 | -0.411 | 1.211 |
| 89.50353291186315 | 0.922 | -0.044 | -0.422 | 1.222 |
| 89.6708813685385 | 0.922 | -0.056 | -0.433 | 1.222 |
| 89.83822982521386 | 0.933 | -0.078 | -0.444 | 1.233 |
| 90.00557828188919 | 0.922 | -0.089 | -0.433 | 1.222 |
| 90.16362960208257 | 0.911 | -0.089 | -0.433 | 1.222 |
| 90.3309780587579 | 0.911 | -0.067 | -0.433 | 1.233 |
| 90.49832651543326 | 0.922 | -0.056 | -0.444 | 1.255 |
| 90.66567497210859 | 0.922 | -0.067 | -0.455 | 1.255 |
| 90.83302342878395 | 0.933 | -0.067 | -0.455 | 1.255 |
| 91.00037188545929 | 0.933 | -0.067 | -0.444 | 1.255 |
| 91.16772034213463 | 0.933 | -0.078 | -0.444 | 1.255 |
| 91.33506879880998 | 0.933 | -0.089 | -0.433 | 1.255 |
| 91.50241725548533 | 0.922 | -0.078 | -0.433 | 1.244 |
| 91.66976571216065 | 0.922 | -0.056 | -0.433 | 1.255 |
| 91.83711416883601 | 0.911 | -0.056 | -0.433 | 1.244 |
| 92.00446262551137 | 0.911 | -0.067 | -0.433 | 1.233 |
| 92.1718110821867 | 0.911 | -0.078 | -0.422 | 1.233 |
| 92.33915953886203 | 0.911 | -0.078 | -0.411 | 1.244 |
| 92.49721085905541 | 0.922 | -0.044 | -0.411 | 1.255 |
| 92.66455931573077 | 0.933 | -0.033 | -0.422 | 1.266 |
| 92.83190777240611 | 0.933 | -0.044 | -0.433 | 1.266 |
| 92.99925622908145 | 0.922 | -0.067 | -0.422 | 1.255 |
| 93.1666046857568 | 0.922 | -0.067 | -0.411 | 1.255 |
| 93.33395314243214 | 0.933 | -0.044 | -0.411 | 1.266 |
| 93.50130159910749 | 0.933 | -0.033 | -0.422 | 1.277 |
| 93.66865005578283 | 0.922 | -0.044 | -0.433 | 1.266 |
| 93.83599851245818 | 0.922 | -0.067 | -0.433 | 1.266 |
| 94.00334696913353 | 0.911 | -0.078 | -0.422 | 1.255 |
| 94.17069542580886 | 0.911 | -0.078 | -0.422 | 1.255 |
| 94.3380438824842 | 0.922 | -0.067 | -0.422 | 1.266 |
| 94.50539233915954 | 0.933 | -0.044 | -0.433 | 1.277 |
| 94.66344365935292 | 0.922 | -0.067 | -0.433 | 1.277 |
| 94.83079211602828 | 0.922 | -0.078 | -0.433 | 1.266 |
| 94.99814057270362 | 0.911 | -0.078 | -0.422 | 1.266 |
| 95.16548902937897 | 0.922 | -0.056 | -0.433 | 1.266 |
| 95.33283748605432 | 0.911 | -0.067 | -0.433 | 1.266 |
| 95.50018594272963 | 0.911 | -0.078 | -0.444 | 1.266 |
| 95.66753439940499 | 0.9 | -0.111 | -0.444 | 1.255 |
| 95.83488285608034 | 0.877 | -0.122 | -0.433 | 1.233 |
| 96.00223131275567 | 0.877 | -0.1 | -0.433 | 1.244 |
| 96.16957976943102 | 0.888 | -0.089 | -0.444 | 1.244 |
| 96.33692822610638 | 0.888 | -0.1 | -0.455 | 1.244 |
| 96.50427668278171 | 0.877 | -0.111 | -0.455 | 1.233 |
| 96.67162513945706 | 0.877 | -0.122 | -0.444 | 1.233 |
| 96.8389735961324 | 0.877 | -0.111 | -0.444 | 1.233 |
| 96.99702491632577 | 0.877 | -0.089 | -0.455 | 1.244 |
| 97.16437337300111 | 0.888 | -0.089 | -0.466 | 1.255 |
| 97.33172182967647 | 0.877 | -0.1 | -0.466 | 1.244 |
| 97.49907028635181 | 0.877 | -0.122 | -0.466 | 1.244 |
| 97.66641874302715 | 0.888 | -0.133 | -0.455 | 1.244 |
| 97.8337671997025 | 0.9 | -0.111 | -0.455 | 1.255 |
| 98.00111565637785 | 0.911 | -0.078 | -0.466 | 1.277 |
| 98.16846411305319 | 0.9 | -0.089 | -0.478 | 1.277 |
| 98.33581256972855 | 0.9 | -0.111 | -0.466 | 1.266 |
| 98.50316102640389 | 0.9 | -0.111 | -0.466 | 1.266 |
| 98.67050948307921 | 0.911 | -0.1 | -0.466 | 1.277 |
| 98.83785793975456 | 0.922 | -0.089 | -0.466 | 1.288 |
| 99.0052063964299 | 0.933 | -0.089 | -0.478 | 1.299 |
| 99.17255485310525 | 0.922 | -0.1 | -0.489 | 1.288 |
| 99.33060617329863 | 0.922 | -0.111 | -0.489 | 1.288 |
| 99.49795462997399 | 0.933 | -0.122 | -0.489 | 1.288 |
| 99.66530308664933 | 0.933 | -0.111 | -0.489 | 1.299 |
| 99.83265154332467 | 0.944 | -0.111 | -0.489 | 1.31 |
| 100.0 | 0.944 | -0.111 | -0.489 | 1.322 |